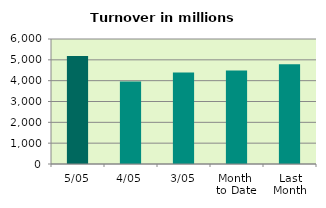
| Category | Series 0 |
|---|---|
| 5/05 | 5188.212 |
| 4/05 | 3954.744 |
| 3/05 | 4392.391 |
| Month 
to Date | 4485.513 |
| Last
Month | 4785.141 |